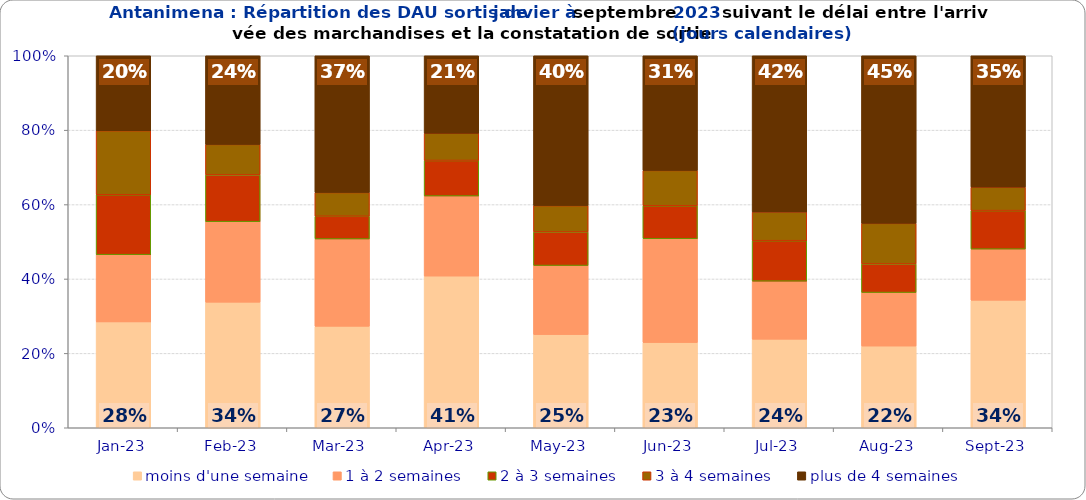
| Category | moins d'une semaine | 1 à 2 semaines | 2 à 3 semaines | 3 à 4 semaines | plus de 4 semaines |
|---|---|---|---|---|---|
| 2023-01-01 | 0.285 | 0.181 | 0.161 | 0.172 | 0.201 |
| 2023-02-01 | 0.338 | 0.216 | 0.126 | 0.082 | 0.238 |
| 2023-03-01 | 0.273 | 0.235 | 0.061 | 0.064 | 0.368 |
| 2023-04-01 | 0.408 | 0.215 | 0.096 | 0.073 | 0.208 |
| 2023-05-01 | 0.25 | 0.186 | 0.09 | 0.071 | 0.403 |
| 2023-06-01 | 0.229 | 0.279 | 0.088 | 0.095 | 0.308 |
| 2023-07-01 | 0.238 | 0.156 | 0.109 | 0.077 | 0.42 |
| 2023-08-01 | 0.22 | 0.144 | 0.077 | 0.109 | 0.451 |
| 2023-09-01 | 0.343 | 0.137 | 0.104 | 0.063 | 0.353 |